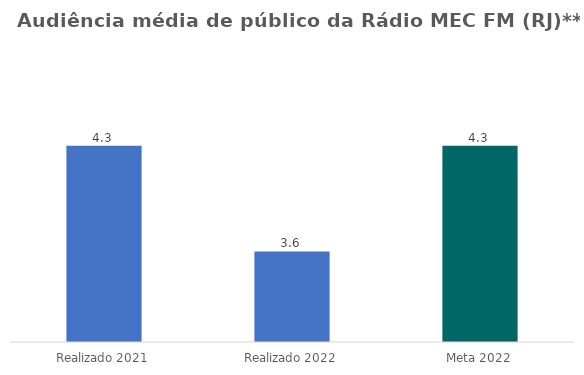
| Category | Series 0 |
|---|---|
| Realizado 2021 | 4.3 |
| Realizado 2022 | 3.6 |
| Meta 2022 | 4.3 |